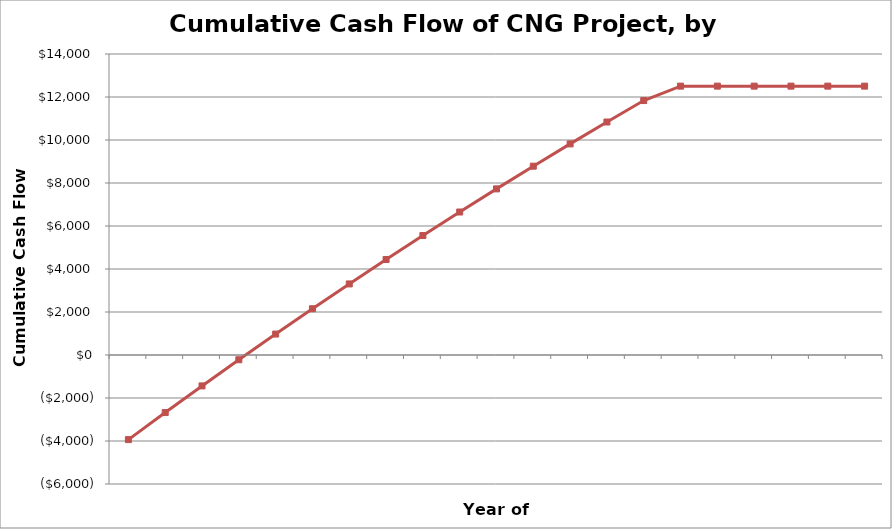
| Category | Series 1 |
|---|---|
|  | -3934870.214 |
|  | -2676050.399 |
|  | -1438216.752 |
|  | -221247.449 |
|  | 974993.976 |
|  | 2150657.399 |
|  | 3305904.958 |
|  | 4440909.971 |
|  | 5555855.922 |
|  | 6650935.509 |
|  | 7726349.756 |
|  | 8782307.18 |
|  | 9819023.005 |
|  | 10836718.436 |
|  | 11835619.97 |
|  | 12505656.021 |
|  | 12505656.021 |
|  | 12505656.021 |
|  | 12505656.021 |
|  | 12505656.021 |
|  | 12505656.021 |